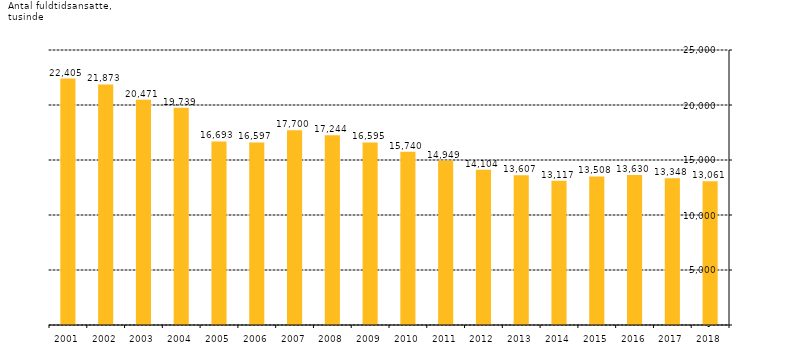
| Category | Series 0 |
|---|---|
| 2018.0 | 13061 |
| 2017.0 | 13347.917 |
| 2016.0 | 13629.6 |
| 2015.0 | 13507.958 |
| 2014.0 | 13116.73 |
| 2013.0 | 13607 |
| 2012.0 | 14104 |
| 2011.0 | 14949 |
| 2010.0 | 15740 |
| 2009.0 | 16595 |
| 2008.0 | 17244.007 |
| 2007.0 | 17700 |
| 2006.0 | 16597 |
| 2005.0 | 16693 |
| 2004.0 | 19739 |
| 2003.0 | 20471 |
| 2002.0 | 21873 |
| 2001.0 | 22405 |